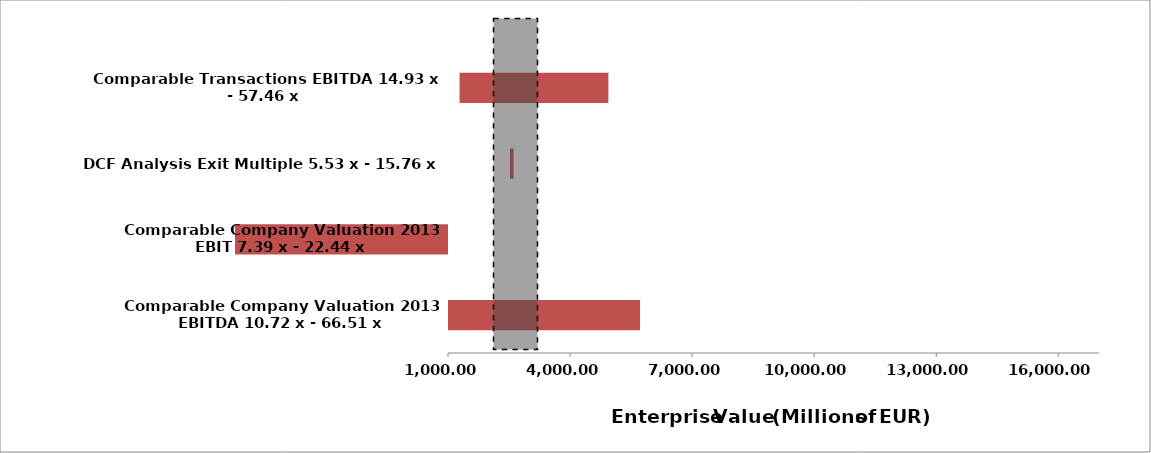
| Category | Series 0 | Series 1 |
|---|---|---|
| Comparable Company Valuation 2013 EBITDA 10.72 x - 66.51 x | 921.92 | 4797.94 |
| Comparable Company Valuation 2013 EBIT 7.39 x - 22.44 x | -4234.704 | -8621.38 |
| DCF Analysis Exit Multiple 5.53 x - 15.76 x | 2524.466 | 87.404 |
| Comparable Transactions EBITDA 14.93 x - 57.46 x | 1283.98 | 3657.58 |